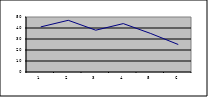
| Category | Series 0 |
|---|---|
| 0 | 41 |
| 1 | 47 |
| 2 | 38 |
| 3 | 44 |
| 4 | 35 |
| 5 | 25 |